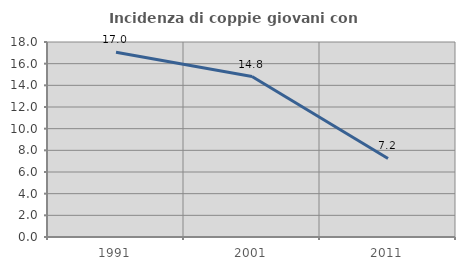
| Category | Incidenza di coppie giovani con figli |
|---|---|
| 1991.0 | 17.05 |
| 2001.0 | 14.809 |
| 2011.0 | 7.246 |